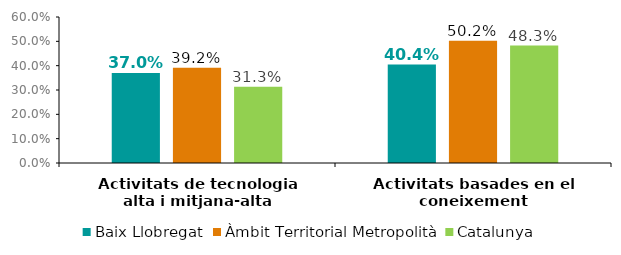
| Category | Baix Llobregat | Àmbit Territorial Metropolità | Catalunya |
|---|---|---|---|
| Activitats de tecnologia alta i mitjana-alta | 0.37 | 0.392 | 0.313 |
| Activitats basades en el coneixement | 0.404 | 0.502 | 0.483 |